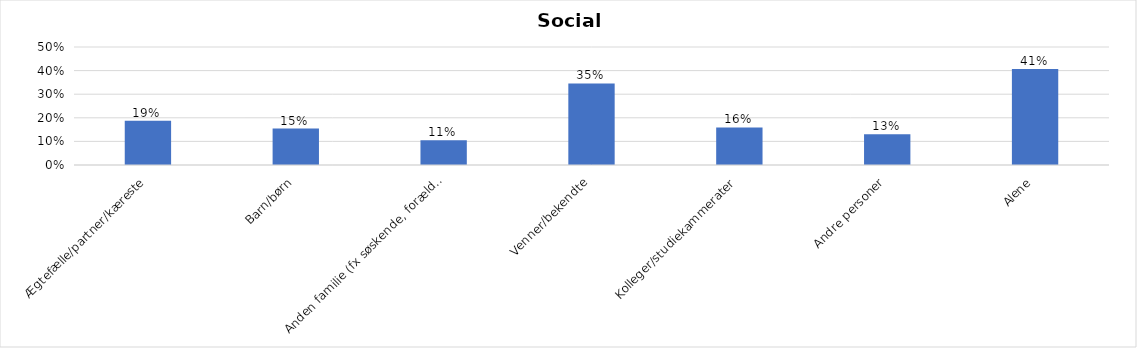
| Category | % |
|---|---|
| Ægtefælle/partner/kæreste | 0.188 |
| Barn/børn | 0.155 |
| Anden familie (fx søskende, forældre) | 0.105 |
| Venner/bekendte | 0.345 |
| Kolleger/studiekammerater | 0.159 |
| Andre personer | 0.131 |
| Alene | 0.407 |